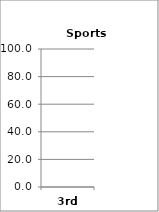
| Category | Sports (Choices) |
|---|---|
| 3rd | 0 |